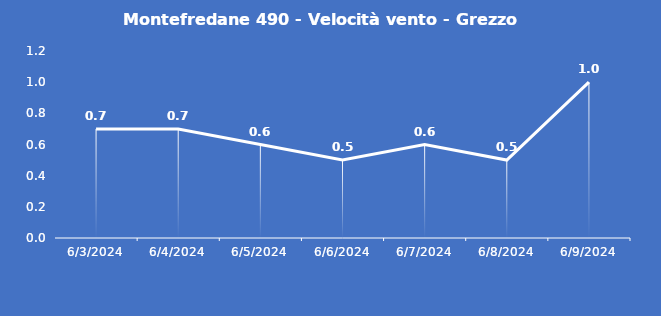
| Category | Montefredane 490 - Velocità vento - Grezzo (m/s) |
|---|---|
| 6/3/24 | 0.7 |
| 6/4/24 | 0.7 |
| 6/5/24 | 0.6 |
| 6/6/24 | 0.5 |
| 6/7/24 | 0.6 |
| 6/8/24 | 0.5 |
| 6/9/24 | 1 |